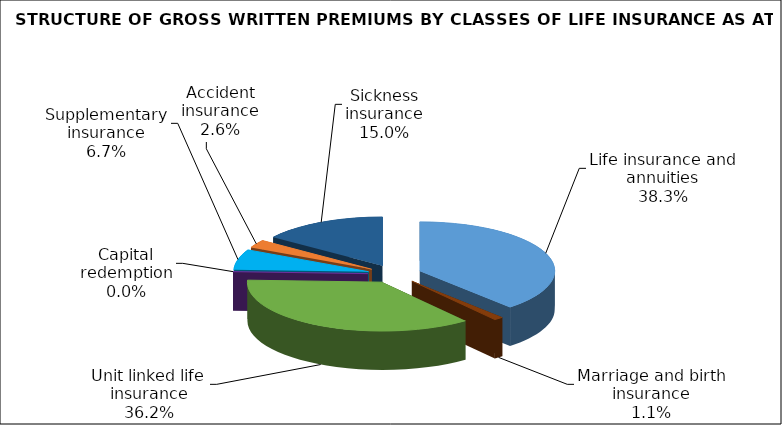
| Category | Series 0 |
|---|---|
| Life insurance and annuities | 93570502.394 |
| Marriage and birth insurance | 2766614.023 |
| Unit linked life insurance | 88347920.179 |
| Capital redemption | 0 |
| Supplementary insurance | 16395836.753 |
| Accident insurance | 6403215.85 |
| Sickness insurance | 36632284.46 |